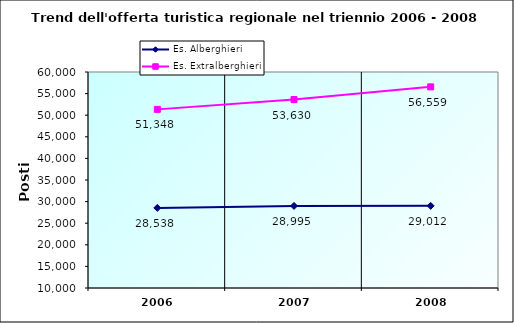
| Category | Es. Alberghieri | Es. Extralberghieri |
|---|---|---|
| 2006.0 | 28538 | 51348 |
| 2007.0 | 28995 | 53630 |
| 2008.0 | 29012 | 56559 |